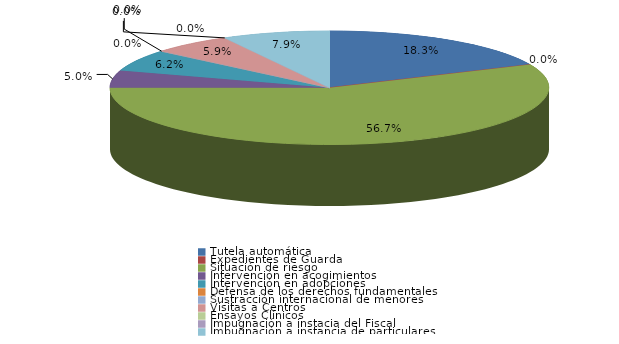
| Category | Series 0 |
|---|---|
| Tutela automática | 74 |
| Expedientes de Guarda | 0 |
| Situación de riesgo | 229 |
| Intervención en acogimientos | 20 |
| Intervención en adopciones | 25 |
| Defensa de los derechos fundamentales | 0 |
| Sustracción internacional de menores | 0 |
| Visitas a Centros | 24 |
| Ensayos Clínicos | 0 |
| Impugnación a instacia del Fiscal | 0 |
| Impugnación a instancia de particulares | 32 |